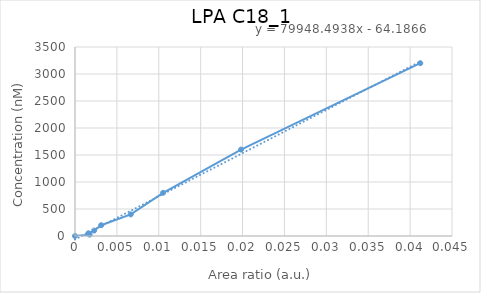
| Category | LPA C18_1 |
|---|---|
| 0.0 | 0 |
| 0.00175039 | 25 |
| 0.00160109 | 50 |
| 0.00228785 | 100 |
| 0.00312289 | 200 |
| 0.00665286 | 400 |
| 0.0105159 | 800 |
| 0.0198214 | 1600 |
| 0.0412121 | 3200 |